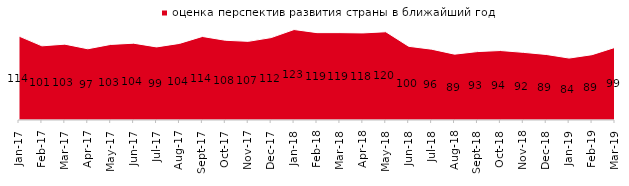
| Category | оценка перспектив развития страны в ближайший год |
|---|---|
| 2017-01-01 | 114 |
| 2017-02-01 | 100.75 |
| 2017-03-01 | 103.05 |
| 2017-04-01 | 96.75 |
| 2017-05-01 | 102.7 |
| 2017-06-01 | 104.35 |
| 2017-07-01 | 99.3 |
| 2017-08-01 | 104.05 |
| 2017-09-01 | 113.5 |
| 2017-10-01 | 108.35 |
| 2017-11-01 | 106.85 |
| 2017-12-01 | 111.95 |
| 2018-01-01 | 122.9 |
| 2018-02-01 | 118.7 |
| 2018-03-01 | 118.7 |
| 2018-04-01 | 118.3 |
| 2018-05-01 | 119.9 |
| 2018-06-01 | 100.1 |
| 2018-07-01 | 96.2 |
| 2018-08-01 | 89.45 |
| 2018-09-01 | 92.95 |
| 2018-10-01 | 94.4 |
| 2018-11-01 | 91.916 |
| 2018-12-01 | 89.05 |
| 2019-01-01 | 84.15 |
| 2019-02-01 | 88.75 |
| 2019-03-01 | 98.657 |